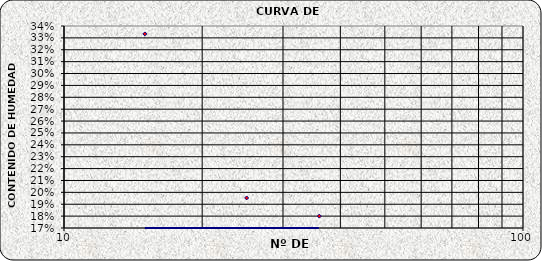
| Category | Series 0 |
|---|---|
| 36.0 | 0.18 |
| 25.0 | 0.195 |
| 15.0 | 0.333 |